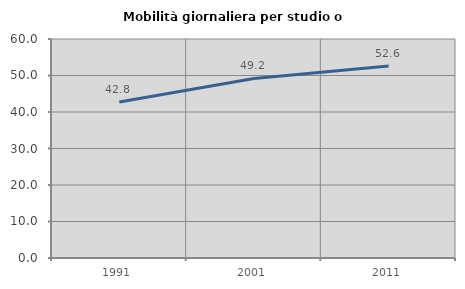
| Category | Mobilità giornaliera per studio o lavoro |
|---|---|
| 1991.0 | 42.758 |
| 2001.0 | 49.189 |
| 2011.0 | 52.587 |